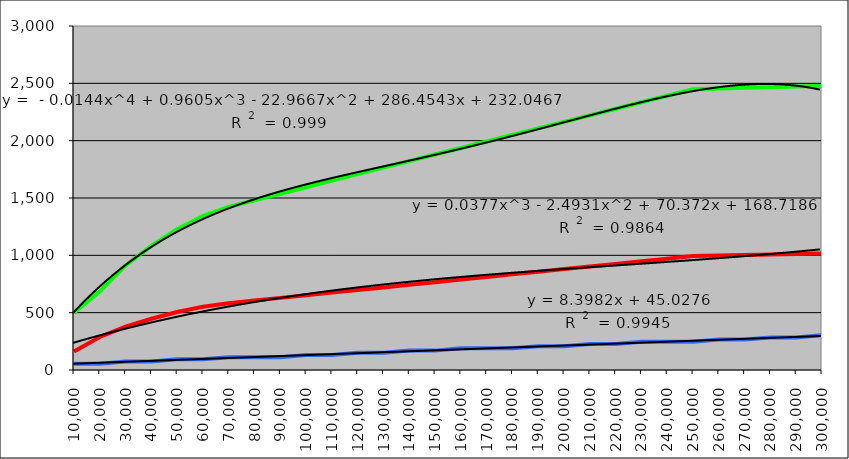
| Category | Ereloon notaris | Ereloon notaris registratie | Ereloon hypotheekbewaarder |
|---|---|---|---|
| 10000.0 | 162 | 500 | 55 |
| 20000.0 | 288 | 684 | 55 |
| 30000.0 | 379 | 912 | 74 |
| 40000.0 | 447 | 1083 | 74 |
| 50000.0 | 506 | 1228 | 93 |
| 60000.0 | 551 | 1342 | 93 |
| 70000.0 | 583 | 1423 | 112 |
| 80000.0 | 606 | 1480 | 112 |
| 90000.0 | 629 | 1537 | 112 |
| 100000.0 | 652 | 1594 | 131 |
| 110000.0 | 675 | 1651 | 131 |
| 120000.0 | 697 | 1708 | 150 |
| 130000.0 | 720 | 1765 | 150 |
| 140000.0 | 743 | 1822 | 169 |
| 150000.0 | 766 | 1879 | 169 |
| 160000.0 | 789 | 1936 | 189 |
| 170000.0 | 811 | 1993 | 189 |
| 180000.0 | 834 | 2050 | 189 |
| 190000.0 | 857 | 2107 | 208 |
| 200000.0 | 880 | 2164 | 208 |
| 210000.0 | 903 | 2221 | 227 |
| 220000.0 | 925 | 2278 | 227 |
| 230000.0 | 948 | 2335 | 246 |
| 240000.0 | 971 | 2392 | 246 |
| 250000.0 | 994 | 2449 | 246 |
| 260000.0 | 998 | 2455 | 265 |
| 270000.0 | 1003 | 2461 | 265 |
| 280000.0 | 1008 | 2466 | 284 |
| 290000.0 | 1012 | 2472 | 284 |
| 300000.0 | 1017 | 2478 | 303 |